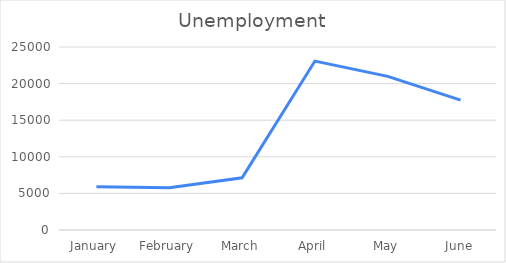
| Category | Series 0 |
|---|---|
| January | 5892 |
| February | 5787 |
| March | 7140 |
| April | 23078 |
| May | 20985 |
| June | 17750 |